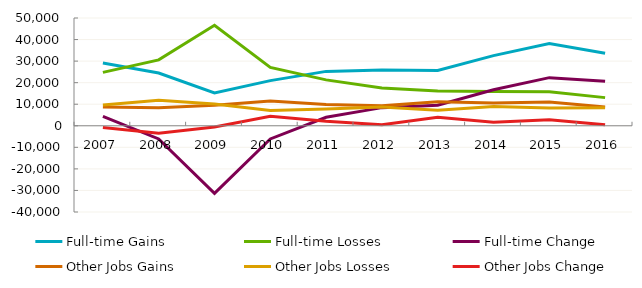
| Category | Full-time Gains | Full-time Losses | Full-time Change | Other Jobs Gains | Other Jobs Losses | Other Jobs Change |
|---|---|---|---|---|---|---|
| 2007.0 | 29128 | 24788 | 4340 | 8752 | 9602 | -850 |
| 2008.0 | 24461 | 30585 | -6124 | 8417 | 11875 | -3458 |
| 2009.0 | 15241 | 46592 | -31351 | 9525 | 10129 | -604 |
| 2010.0 | 20941 | 27051 | -6110 | 11539 | 7080 | 4459 |
| 2011.0 | 25233 | 21299 | 3934 | 9885 | 7796 | 2089 |
| 2012.0 | 25932 | 17517 | 8415 | 9285 | 8754 | 531 |
| 2013.0 | 25618 | 16086 | 9532 | 11197 | 7199 | 3998 |
| 2014.0 | 32533 | 15850 | 16683 | 10564 | 8973 | 1591 |
| 2015.0 | 38158 | 15830 | 22328 | 11073 | 8299 | 2774 |
| 2016.0 | 33694 | 13062 | 20632 | 8760 | 8317 | 443 |